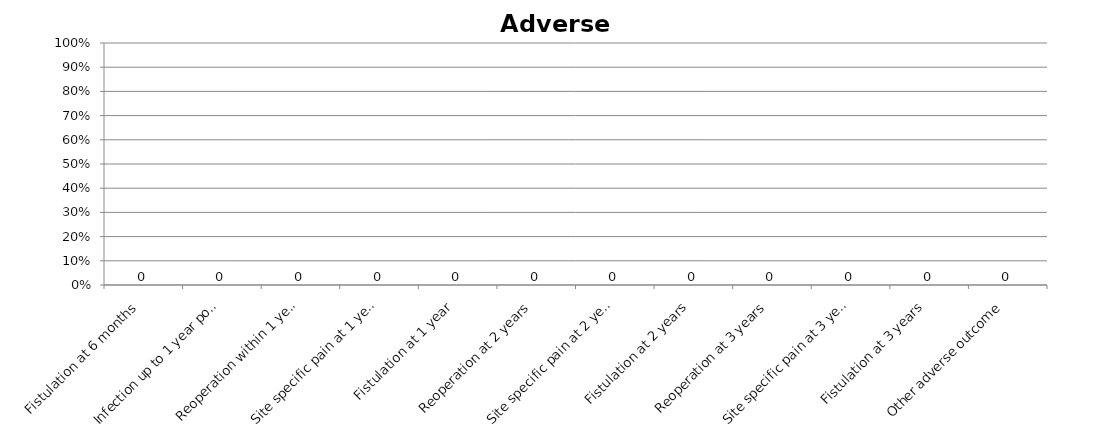
| Category | Series 0 |
|---|---|
| Fistulation at 6 months | 0 |
| Infection up to 1 year post procedure | 0 |
| Reoperation within 1 year post procedure | 0 |
| Site specific pain at 1 year | 0 |
| Fistulation at 1 year | 0 |
| Reoperation at 2 years | 0 |
| Site specific pain at 2 years | 0 |
| Fistulation at 2 years | 0 |
| Reoperation at 3 years | 0 |
| Site specific pain at 3 years | 0 |
| Fistulation at 3 years | 0 |
| Other adverse outcome | 0 |